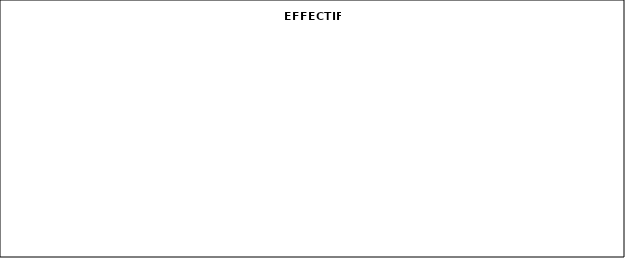
| Category | EFFECTIF |
|---|---|
| 6EME | 0 |
| 6EME SEGPA | 0 |
| 5EME | 0 |
| 5EME SEGPA | 0 |
| 4EME | 0 |
| 4EME SEGPA | 0 |
| 3EME DRA | 0 |
| 3EME PREPRO | 0 |
| 3EME SEGPA | 0 |
| ULIS | 0 |
| 3EME_G | 0 |
| 1CAP | 0 |
| 2CAP | 0 |
| 2BGT | 0 |
| 2BPR | 0 |
| 1BGT | 0 |
| 1BPR | 0 |
| TBGT | 0 |
| TBPR | 0 |